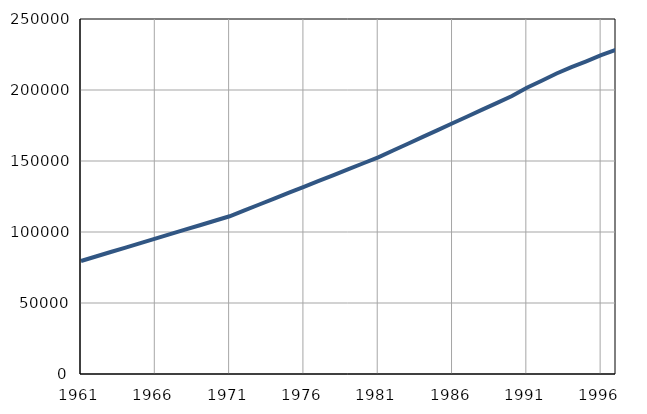
| Category | Број
становника |
|---|---|
| 1961.0 | 79594 |
| 1962.0 | 82741 |
| 1963.0 | 85888 |
| 1964.0 | 89035 |
| 1965.0 | 92182 |
| 1966.0 | 95329 |
| 1967.0 | 98476 |
| 1968.0 | 101623 |
| 1969.0 | 104770 |
| 1970.0 | 107917 |
| 1971.0 | 111067 |
| 1972.0 | 115217 |
| 1973.0 | 119367 |
| 1974.0 | 123517 |
| 1975.0 | 127667 |
| 1976.0 | 131817 |
| 1977.0 | 135967 |
| 1978.0 | 140117 |
| 1979.0 | 144267 |
| 1980.0 | 148417 |
| 1981.0 | 152562 |
| 1982.0 | 157364 |
| 1983.0 | 162166 |
| 1984.0 | 166968 |
| 1985.0 | 171770 |
| 1986.0 | 176572 |
| 1987.0 | 181374 |
| 1988.0 | 186176 |
| 1989.0 | 190978 |
| 1990.0 | 195780 |
| 1991.0 | 201600 |
| 1992.0 | 206500 |
| 1993.0 | 211600 |
| 1994.0 | 216100 |
| 1995.0 | 220200 |
| 1996.0 | 224500 |
| 1997.0 | 228400 |